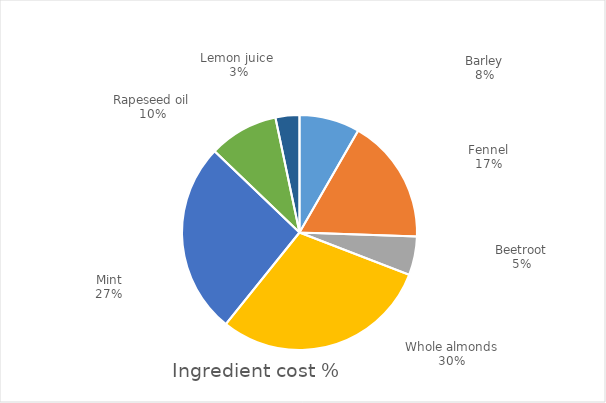
| Category | Total cost |
|---|---|
| Barley | 0.044 |
| Fennel | 0.091 |
| Beetroot | 0.028 |
| Whole almonds | 0.158 |
| Mint | 0.14 |
| Rapeseed oil | 0.051 |
| Lemon juice  | 0.017 |